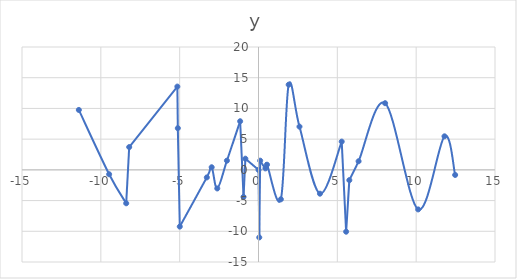
| Category | y |
|---|---|
| -11.39531869288232 | 9.754 |
| -9.473135483865596 | -0.714 |
| -8.390715290764524 | -5.44 |
| -8.200172356962092 | 3.709 |
| -5.1464018684362225 | 13.556 |
| -5.117101172821001 | 6.787 |
| -4.993137743957921 | -9.237 |
| -3.277598405517787 | -1.228 |
| -2.9699774898013365 | 0.423 |
| -2.6145744834544478 | -3.027 |
| -2.002859038867334 | 1.496 |
| -1.1640002704689083 | 7.915 |
| -0.9485810974385086 | -4.399 |
| -0.8322936730942848 | 1.819 |
| 0.0 | 0 |
| 0.04868267786855864 | -11 |
| 0.10610580250155435 | 1.496 |
| 0.4387912809451864 | 0.24 |
| 0.5403023058681398 | 0.841 |
| 1.4183109273161312 | -4.795 |
| 1.9143210549096705 | 13.869 |
| 2.5997648837626937 | 7.035 |
| 3.89768375860193 | -3.88 |
| 5.277315780403132 | 4.599 |
| 5.5580047256595675 | -10.068 |
| 5.761021719902196 | -1.676 |
| 6.347819567232152 | 1.398 |
| 8.031428954683543 | 10.851 |
| 10.126247504789905 | -6.439 |
| 11.796808158852551 | 5.462 |
| 12.472478489732259 | -0.829 |